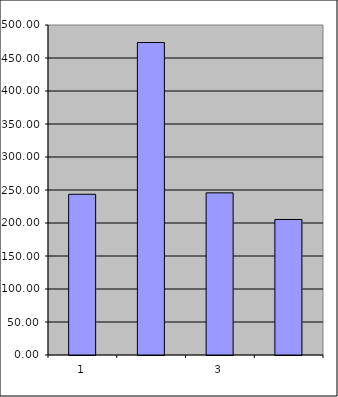
| Category | Series 0 |
|---|---|
| 0 | 243.5 |
| 1 | 473.469 |
| 2 | 245.676 |
| 3 | 205.332 |